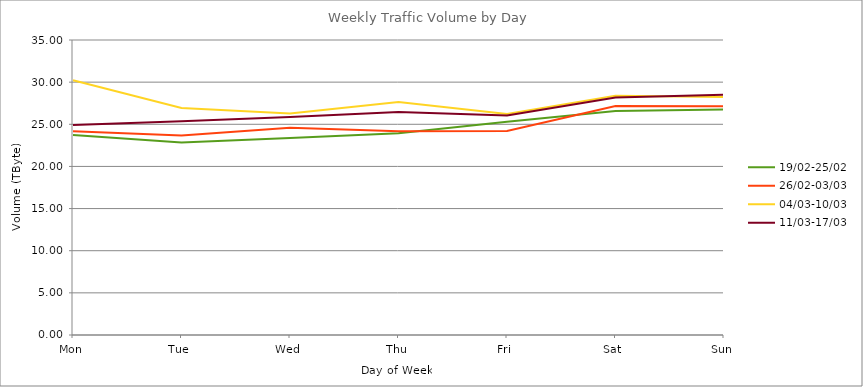
| Category | 19/02-25/02 | 26/02-03/03 | 04/03-10/03 | 11/03-17/03 |
|---|---|---|---|---|
| Mon | 23.72 | 24.18 | 30.22 | 24.92 |
| Tue | 22.83 | 23.68 | 26.94 | 25.37 |
| Wed | 23.37 | 24.58 | 26.29 | 25.87 |
| Thu | 23.95 | 24.18 | 27.65 | 26.47 |
| Fri | 25.31 | 24.2 | 26.23 | 26.04 |
| Sat | 26.59 | 27.18 | 28.38 | 28.17 |
| Sun | 26.77 | 27.15 | 28.23 | 28.51 |